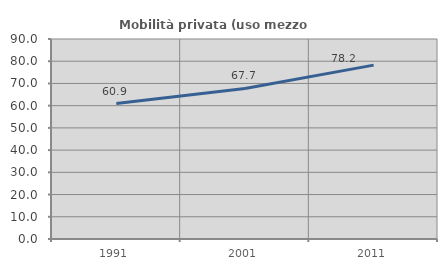
| Category | Mobilità privata (uso mezzo privato) |
|---|---|
| 1991.0 | 60.94 |
| 2001.0 | 67.729 |
| 2011.0 | 78.235 |